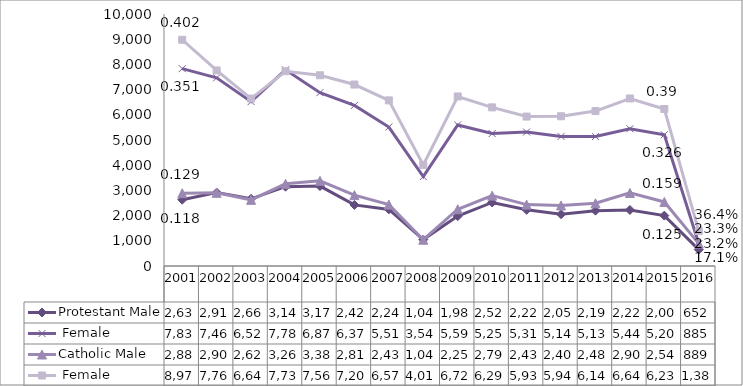
| Category | Protestant | Catholic |
|---|---|---|
| 2001.0 | 7831 | 8978 |
| 2002.0 | 7468 | 7760 |
| 2003.0 | 6522 | 6644 |
| 2004.0 | 7786 | 7730 |
| 2005.0 | 6879 | 7568 |
| 2006.0 | 6372 | 7201 |
| 2007.0 | 5513 | 6572 |
| 2008.0 | 3548 | 4011 |
| 2009.0 | 5598 | 6728 |
| 2010.0 | 5256 | 6295 |
| 2011.0 | 5316 | 5930 |
| 2012.0 | 5141 | 5943 |
| 2013.0 | 5136 | 6148 |
| 2014.0 | 5447 | 6648 |
| 2015.0 | 5209 | 6230 |
| 2016.0 | 885 | 1387 |